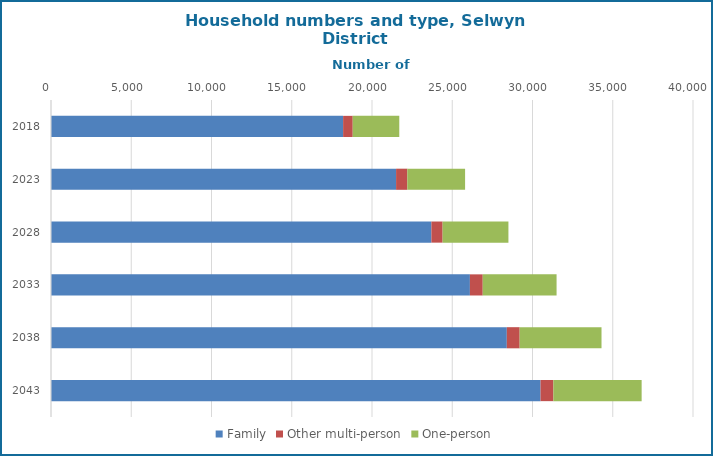
| Category | Family | Other multi-person | One-person |
|---|---|---|---|
| 2018.0 | 18200 | 600 | 2900 |
| 2023.0 | 21500 | 700 | 3600 |
| 2028.0 | 23700 | 700 | 4100 |
| 2033.0 | 26100 | 800 | 4600 |
| 2038.0 | 28400 | 800 | 5100 |
| 2043.0 | 30500 | 800 | 5500 |